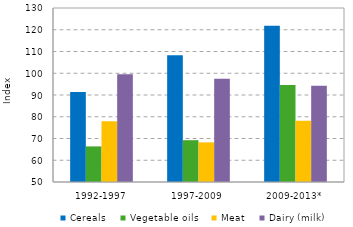
| Category | Cereals | Vegetable oils | Meat | Dairy (milk) |
|---|---|---|---|---|
| 1992-1997 | 91.352 | 66.363 | 77.968 | 99.567 |
| 1997-2009 | 108.292 | 69.221 | 68.227 | 97.473 |
| 2009-2013* | 121.855 | 94.613 | 78.212 | 94.291 |